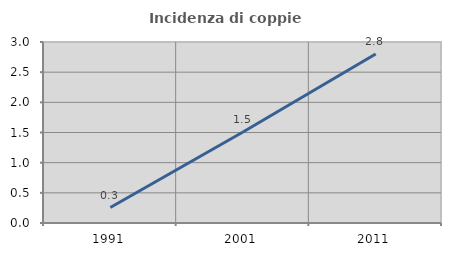
| Category | Incidenza di coppie miste |
|---|---|
| 1991.0 | 0.256 |
| 2001.0 | 1.508 |
| 2011.0 | 2.801 |